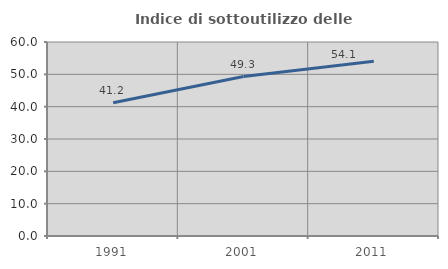
| Category | Indice di sottoutilizzo delle abitazioni  |
|---|---|
| 1991.0 | 41.232 |
| 2001.0 | 49.306 |
| 2011.0 | 54.082 |